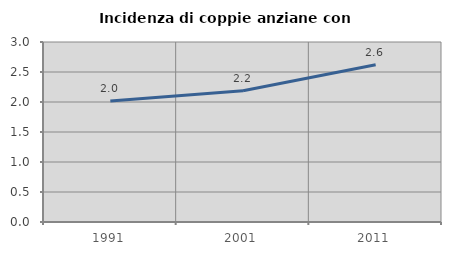
| Category | Incidenza di coppie anziane con figli |
|---|---|
| 1991.0 | 2.015 |
| 2001.0 | 2.188 |
| 2011.0 | 2.621 |